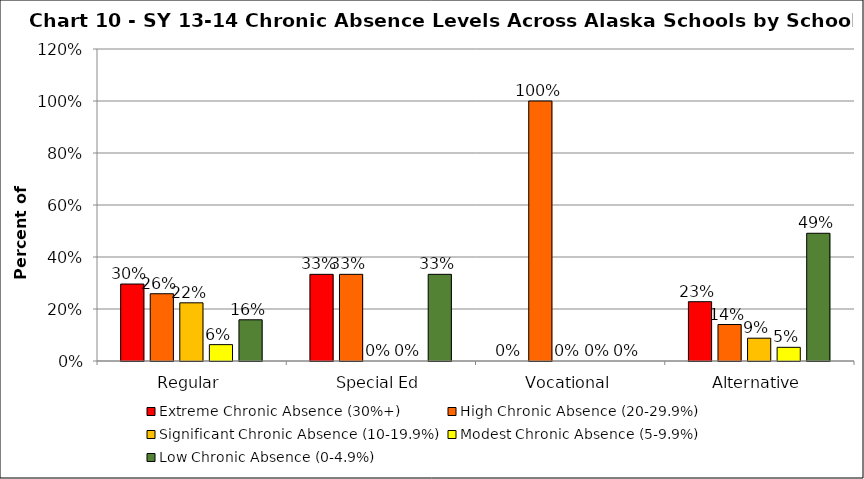
| Category | Extreme Chronic Absence (30%+) | High Chronic Absence (20-29.9%) | Significant Chronic Absence (10-19.9%) | Modest Chronic Absence (5-9.9%) | Low Chronic Absence (0-4.9%) |
|---|---|---|---|---|---|
| 0 | 0.296 | 0.259 | 0.224 | 0.063 | 0.159 |
| 1 | 0.333 | 0.333 | 0 | 0 | 0.333 |
| 2 | 0 | 1 | 0 | 0 | 0 |
| 3 | 0.228 | 0.14 | 0.088 | 0.053 | 0.491 |